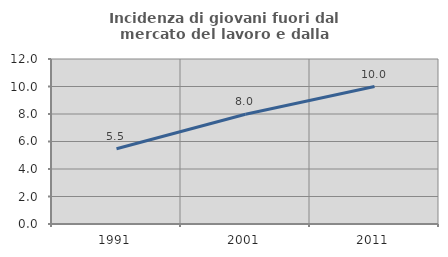
| Category | Incidenza di giovani fuori dal mercato del lavoro e dalla formazione  |
|---|---|
| 1991.0 | 5.473 |
| 2001.0 | 7.979 |
| 2011.0 | 10 |